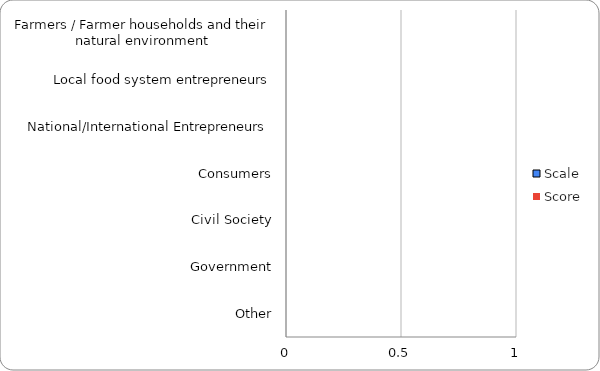
| Category | Scale | Score |
|---|---|---|
| Farmers / Farmer households and their natural environment | 0 | 0 |
| Local food system entrepreneurs | 0 | 0 |
| National/International Entrepreneurs | 0 | 0 |
| Consumers | 0 | 0 |
| Civil Society | 0 | 0 |
| Government | 0 | 0 |
| Other | 0 | 0 |